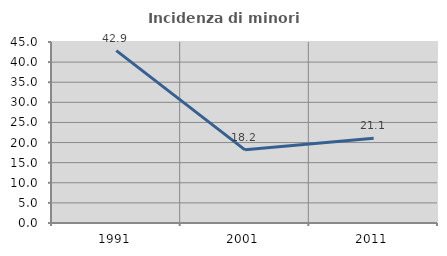
| Category | Incidenza di minori stranieri |
|---|---|
| 1991.0 | 42.857 |
| 2001.0 | 18.182 |
| 2011.0 | 21.053 |